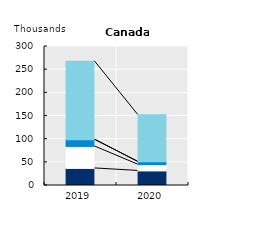
| Category | International seasonal workers | Working holidaymakers | Intra-company transferees | International trainees | Other temporary migrant workers |
|---|---|---|---|---|---|
| 2019.0 | 36.85 | 47.463 | 14.625 |  | 169.002 |
| 2020.0 | 31.48 | 13.588 | 6.05 |  | 101.437 |